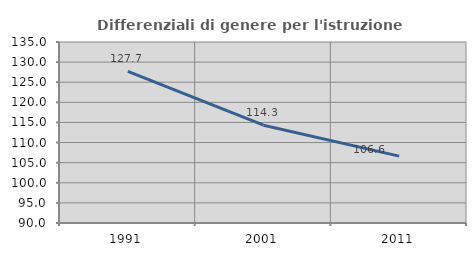
| Category | Differenziali di genere per l'istruzione superiore |
|---|---|
| 1991.0 | 127.721 |
| 2001.0 | 114.315 |
| 2011.0 | 106.635 |